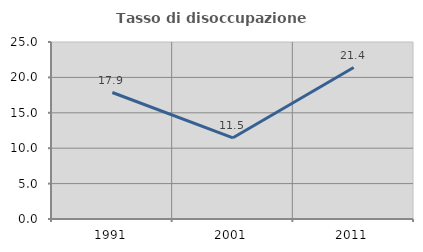
| Category | Tasso di disoccupazione giovanile  |
|---|---|
| 1991.0 | 17.867 |
| 2001.0 | 11.47 |
| 2011.0 | 21.397 |